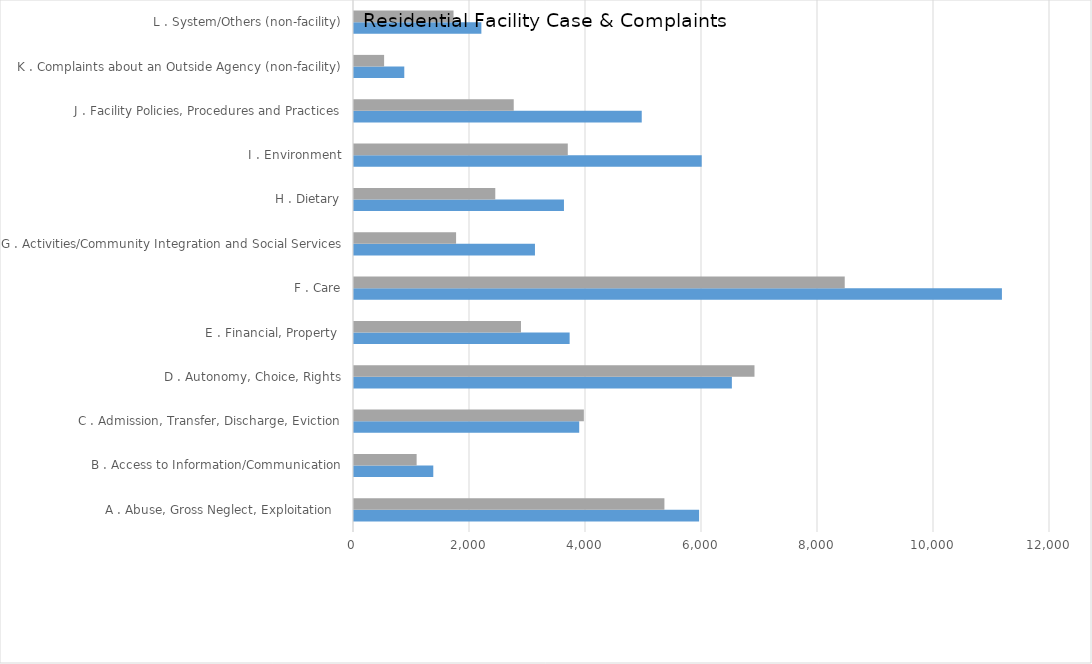
| Category | Residential Care Community 
FFY 2019 | Residential Care Community 
FFY 2020 |
|---|---|---|
| A . Abuse, Gross Neglect, Exploitation   | 5950 | 5352 |
| B . Access to Information/Communication | 1367 | 1080 |
| C . Admission, Transfer, Discharge, Eviction | 3883 | 3963 |
| D . Autonomy, Choice, Rights | 6515 | 6905 |
| E . Financial, Property  | 3718 | 2879 |
| F . Care | 11171 | 8461 |
| G . Activities/Community Integration and Social Services | 3120 | 1760 |
| H . Dietary | 3620 | 2436 |
| I . Environment | 5995 | 3686 |
| J . Facility Policies, Procedures and Practices | 4961 | 2754 |
| K . Complaints about an Outside Agency (non-facility) | 867 | 519 |
| L . System/Others (non-facility) | 2196 | 1716 |